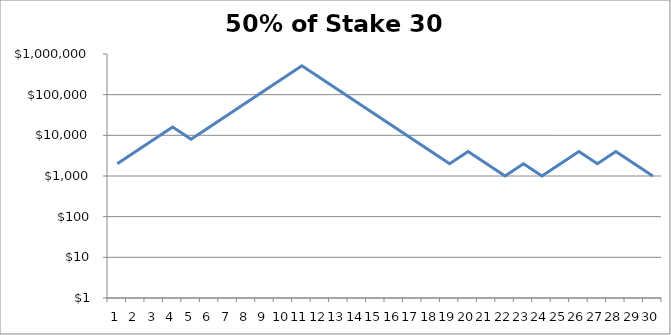
| Category | Series 0 |
|---|---|
| 0 | 2000 |
| 1 | 4000 |
| 2 | 8000 |
| 3 | 16000 |
| 4 | 8000 |
| 5 | 16000 |
| 6 | 32000 |
| 7 | 64000 |
| 8 | 128000 |
| 9 | 256000 |
| 10 | 512000 |
| 11 | 256000 |
| 12 | 128000 |
| 13 | 64000 |
| 14 | 32000 |
| 15 | 16000 |
| 16 | 8000 |
| 17 | 4000 |
| 18 | 2000 |
| 19 | 4000 |
| 20 | 2000 |
| 21 | 1000 |
| 22 | 2000 |
| 23 | 1000 |
| 24 | 2000 |
| 25 | 4000 |
| 26 | 2000 |
| 27 | 4000 |
| 28 | 2000 |
| 29 | 1000 |